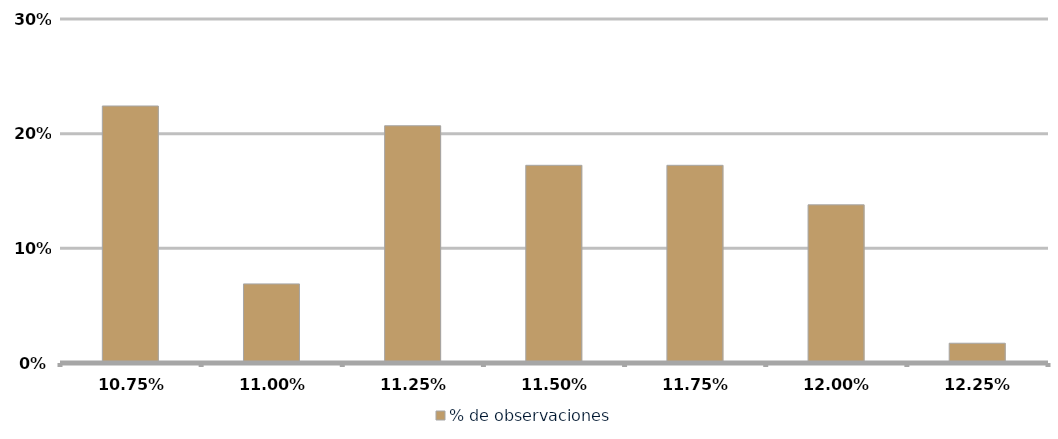
| Category | % de observaciones  |
|---|---|
| 0.1075 | 0.224 |
| 0.11 | 0.069 |
| 0.1125 | 0.207 |
| 0.115 | 0.172 |
| 0.11750000000000001 | 0.172 |
| 0.12000000000000001 | 0.138 |
| 0.12250000000000001 | 0.017 |